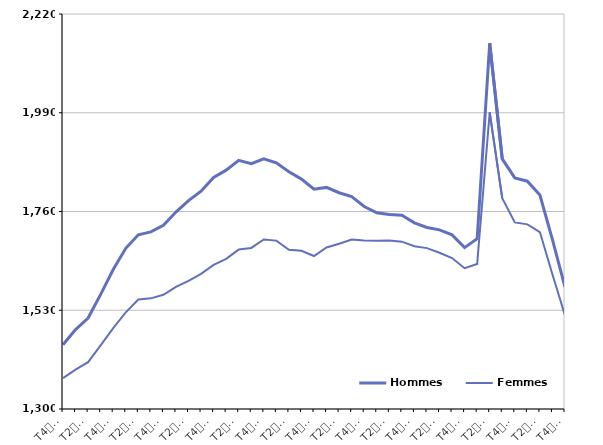
| Category | Hommes  | Femmes  |
|---|---|---|
| T4
2011 | 1449.7 | 1371.8 |
| T1
2012 | 1484.8 | 1391.6 |
| T2
2012 | 1511.8 | 1409 |
| T3
2012 | 1566.9 | 1448.3 |
| T4
2012 | 1624.7 | 1488.3 |
| T1
2013 | 1674.2 | 1525.1 |
| T2
2013 | 1705.8 | 1555.1 |
| T3
2013 | 1712.4 | 1557.7 |
| T4
2013 | 1727.9 | 1565.9 |
| T1
2014 | 1758.7 | 1584.3 |
| T2
2014 | 1785.3 | 1598.4 |
| T3
2014 | 1807.3 | 1614.8 |
| T4
2014 | 1839.3 | 1635.5 |
| T1
2015 | 1856.3 | 1649.7 |
| T2
2015 | 1879.2 | 1671.3 |
| T3
2015 | 1871.6 | 1675.1 |
| T4
2015 | 1882.9 | 1694.8 |
| T1
2016 | 1873.3 | 1692.2 |
| T2
2016 | 1852.7 | 1670.7 |
| T3
2016 | 1835.5 | 1668.5 |
| T4
2016 | 1812 | 1656.3 |
| T1
2017 | 1816.1 | 1676.2 |
| T2
2017 | 1803.7 | 1685 |
| T3
2017 | 1794.7 | 1694.9 |
| T4
2017 | 1771.7 | 1692.3 |
| T1
2018 | 1756.9 | 1691.8 |
| T2
2018 | 1752.8 | 1692.6 |
| T3
2018 | 1751.3 | 1689.8 |
| T4
2018 | 1733.6 | 1679 |
| T1
2019 | 1722.9 | 1674.7 |
| T2
2019 | 1717.3 | 1663.8 |
| T3
2019 | 1705.6 | 1651.7 |
| T4
2019 | 1675.9 | 1628 |
| T1
2020 | 1696.4 | 1637.7 |
| T2
2020 | 2151.9 | 1990.8 |
| T3
2020 | 1882.4 | 1790.8 |
| T4
2020 | 1838.2 | 1734.5 |
| T1
2021 | 1830.6 | 1730 |
| T2
2021 | 1798.4 | 1712.1 |
| T3
2021 | 1694.3 | 1613.1 |
| T4
2021 | 1583.9 | 1517.9 |